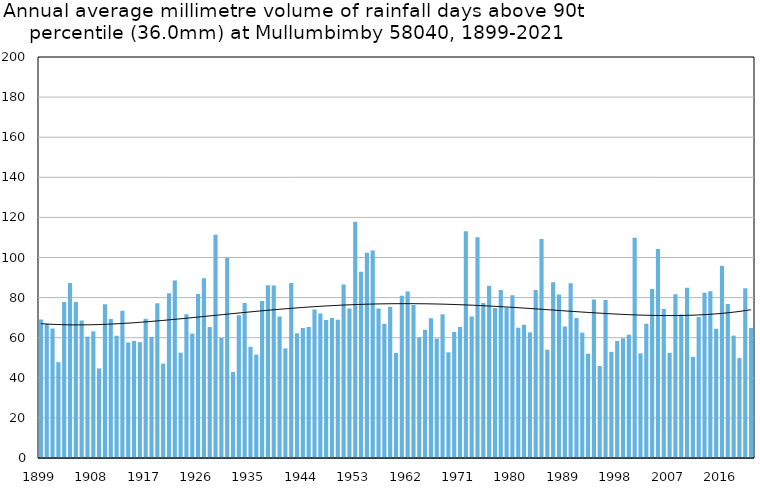
| Category | Annual average mm in days above 90th percentile |
|---|---|
| 1899 | 69.025 |
| 1900 | 66.836 |
| 1901 | 64.536 |
| 1902 | 47.829 |
| 1903 | 77.823 |
| 1904 | 87.308 |
| 1905 | 77.8 |
| 1906 | 68.569 |
| 1907 | 60.556 |
| 1908 | 63.133 |
| 1909 | 44.68 |
| 1910 | 76.647 |
| 1911 | 69.343 |
| 1912 | 61 |
| 1913 | 73.4 |
| 1914 | 57.609 |
| 1915 | 58.4 |
| 1916 | 57.767 |
| 1917 | 69.44 |
| 1918 | 60.417 |
| 1919 | 77.133 |
| 1920 | 47.093 |
| 1921 | 82.217 |
| 1922 | 88.529 |
| 1923 | 52.514 |
| 1924 | 71.708 |
| 1925 | 62.07 |
| 1926 | 81.8 |
| 1927 | 89.626 |
| 1928 | 65.35 |
| 1929 | 111.346 |
| 1930 | 59.9 |
| 1931 | 99.771 |
| 1932 | 42.875 |
| 1933 | 71.194 |
| 1934 | 77.333 |
| 1935 | 55.456 |
| 1936 | 51.6 |
| 1937 | 78.256 |
| 1938 | 86.185 |
| 1939 | 86.062 |
| 1940 | 70.533 |
| 1941 | 54.662 |
| 1942 | 87.255 |
| 1943 | 62.22 |
| 1944 | 64.856 |
| 1945 | 65.331 |
| 1946 | 74.073 |
| 1947 | 72.067 |
| 1948 | 68.835 |
| 1949 | 69.77 |
| 1950 | 68.937 |
| 1951 | 86.54 |
| 1952 | 74.511 |
| 1953 | 117.84 |
| 1954 | 92.947 |
| 1955 | 102.354 |
| 1956 | 103.55 |
| 1957 | 74.588 |
| 1958 | 66.9 |
| 1959 | 75.394 |
| 1960 | 52.42 |
| 1961 | 80.938 |
| 1962 | 83.084 |
| 1963 | 76.283 |
| 1964 | 60.025 |
| 1965 | 63.99 |
| 1966 | 69.67 |
| 1967 | 59.567 |
| 1968 | 71.643 |
| 1969 | 52.722 |
| 1970 | 62.877 |
| 1971 | 65.383 |
| 1972 | 113.071 |
| 1973 | 70.557 |
| 1974 | 110.042 |
| 1975 | 77.25 |
| 1976 | 85.969 |
| 1977 | 74.76 |
| 1978 | 83.815 |
| 1979 | 74.95 |
| 1980 | 81.218 |
| 1981 | 65 |
| 1982 | 66.429 |
| 1983 | 62.67 |
| 1984 | 83.812 |
| 1985 | 109.2 |
| 1986 | 54 |
| 1987 | 87.688 |
| 1988 | 81.524 |
| 1989 | 65.571 |
| 1990 | 87.2 |
| 1991 | 69.875 |
| 1992 | 62.5 |
| 1993 | 52 |
| 1994 | 79 |
| 1995 | 45.875 |
| 1996 | 78.783 |
| 1997 | 52.938 |
| 1998 | 58.356 |
| 1999 | 59.674 |
| 2000 | 61.5 |
| 2001 | 109.9 |
| 2002 | 52.2 |
| 2003 | 67 |
| 2004 | 84.333 |
| 2005 | 104.286 |
| 2006 | 74.288 |
| 2007 | 52.433 |
| 2008 | 81.692 |
| 2009 | 71.6 |
| 2010 | 84.907 |
| 2011 | 50.455 |
| 2012 | 70.267 |
| 2013 | 82.373 |
| 2014 | 83.133 |
| 2015 | 64.459 |
| 2016 | 95.92 |
| 2017 | 76.78 |
| 2018 | 61.055 |
| 2019 | 49.85 |
| 2020 | 84.624 |
| 2021 | 64.871 |